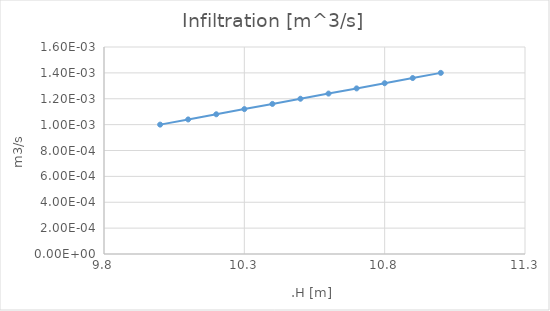
| Category | Infiltration |
|---|---|
| 10.0 | 0.001 |
| 10.1 | 0.001 |
| 10.2 | 0.001 |
| 10.299999999999999 | 0.001 |
| 10.399999999999999 | 0.001 |
| 10.499999999999998 | 0.001 |
| 10.599999999999998 | 0.001 |
| 10.699999999999998 | 0.001 |
| 10.799999999999997 | 0.001 |
| 10.899999999999997 | 0.001 |
| 10.999999999999996 | 0.001 |